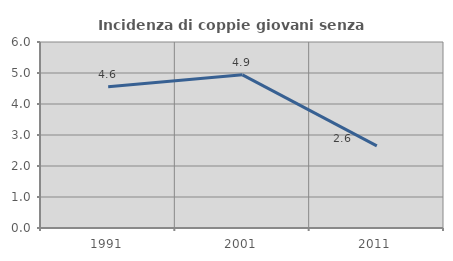
| Category | Incidenza di coppie giovani senza figli |
|---|---|
| 1991.0 | 4.557 |
| 2001.0 | 4.941 |
| 2011.0 | 2.648 |